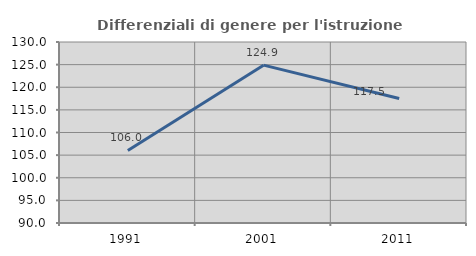
| Category | Differenziali di genere per l'istruzione superiore |
|---|---|
| 1991.0 | 106.035 |
| 2001.0 | 124.885 |
| 2011.0 | 117.506 |